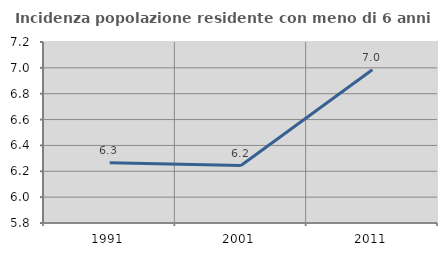
| Category | Incidenza popolazione residente con meno di 6 anni |
|---|---|
| 1991.0 | 6.266 |
| 2001.0 | 6.245 |
| 2011.0 | 6.985 |